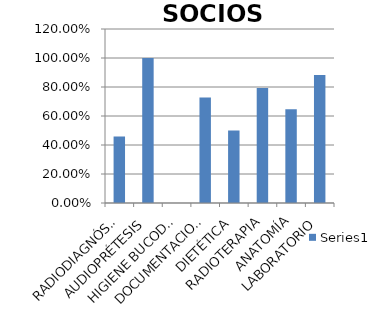
| Category | Series 0 |
|---|---|
| RADIODIAGNÓSTICO | 0.459 |
| AUDIOPRÉTESIS | 1 |
| HIGIENE BUCODENTAL | 0 |
| DOCUMENTACION | 0.727 |
| DIETÉTICA | 0.5 |
| RADIOTERAPIA | 0.793 |
| ANATOMÍA | 0.647 |
| LABORATORIO | 0.883 |